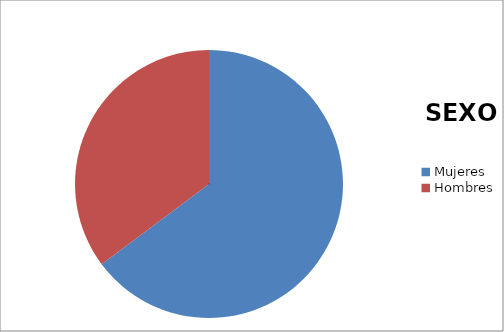
| Category | Series 0 |
|---|---|
| Mujeres | 46 |
| Hombres | 25 |